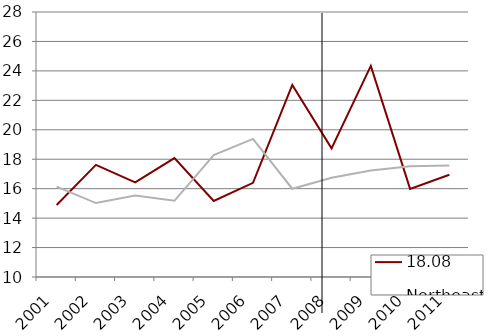
| Category | 18.08 | Northeast |
|---|---|---|
| 2001.0 | 14.894 | 16.141 |
| 2002.0 | 17.613 | 15.021 |
| 2003.0 | 16.421 | 15.532 |
| 2004.0 | 18.081 | 15.176 |
| 2005.0 | 15.161 | 18.284 |
| 2006.0 | 16.398 | 19.378 |
| 2007.0 | 23.047 | 15.995 |
| 2008.0 | 18.741 | 16.736 |
| 2009.0 | 24.338 | 17.237 |
| 2010.0 | 15.987 | 17.527 |
| 2011.0 | 16.947 | 17.57 |